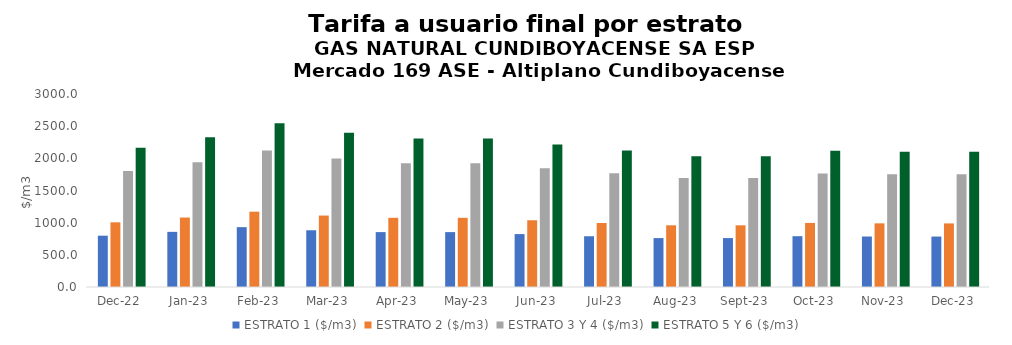
| Category | ESTRATO 1 ($/m3) | ESTRATO 2 ($/m3) | ESTRATO 3 Y 4 ($/m3) | ESTRATO 5 Y 6 ($/m3) |
|---|---|---|---|---|
| 2022-12-01 | 797.7 | 1005.41 | 1803.47 | 2164.164 |
| 2023-01-01 | 857 | 1079.63 | 1940.74 | 2328.888 |
| 2023-02-01 | 930.14 | 1170.78 | 2119.87 | 2543.844 |
| 2023-03-01 | 882 | 1110.47 | 1998.36 | 2398.032 |
| 2023-04-01 | 853.19 | 1075.46 | 1923.35 | 2308.02 |
| 2023-05-01 | 853.19 | 1075.46 | 1923.35 | 2308.02 |
| 2023-06-01 | 822.7 | 1037.61 | 1845.24 | 2214.288 |
| 2023-07-01 | 788.93 | 994.99 | 1769.1 | 2122.92 |
| 2023-08-01 | 760.33 | 959.38 | 1694.56 | 2033.472 |
| 2023-09-01 | 760.57 | 958.84 | 1694.55 | 2033.46 |
| 2023-10-01 | 789.68 | 995.66 | 1764.51 | 2117.412 |
| 2023-11-01 | 784.66 | 989.45 | 1750.95 | 2101.14 |
| 2023-12-01 | 783.85 | 988.36 | 1750.95 | 2101.14 |